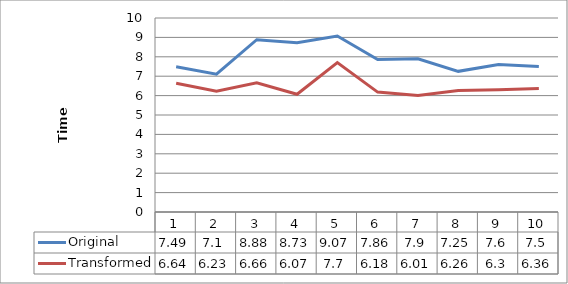
| Category | Original | Transformed |
|---|---|---|
| 0 | 7.49 | 6.64 |
| 1 | 7.1 | 6.23 |
| 2 | 8.88 | 6.66 |
| 3 | 8.73 | 6.07 |
| 4 | 9.07 | 7.7 |
| 5 | 7.86 | 6.18 |
| 6 | 7.9 | 6.01 |
| 7 | 7.25 | 6.26 |
| 8 | 7.6 | 6.3 |
| 9 | 7.5 | 6.36 |